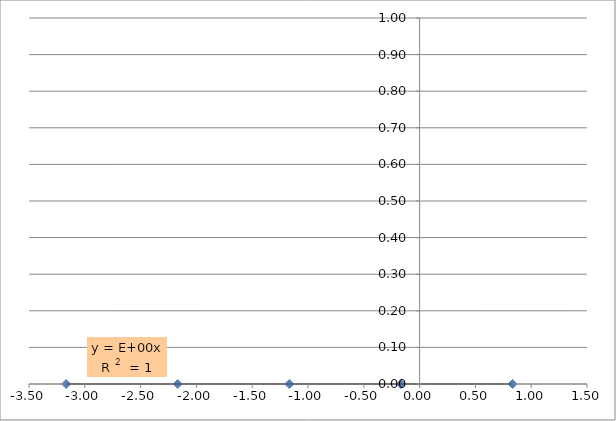
| Category | Series 0 |
|---|---|
| 0.832508912706236 | 0 |
| -0.167491087293764 | 0 |
| -1.167491087293764 | 0 |
| -2.167491087293764 | 0 |
| -3.167491087293764 | 0 |